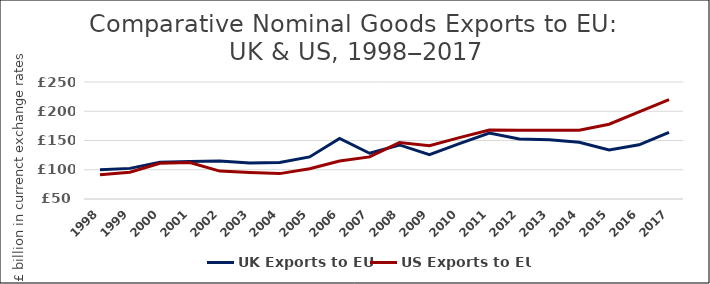
| Category | UK Exports to EU | US Exports to EU |
|---|---|---|
| 1998 | 100.111 | 91.649 |
| 1999 | 102.352 | 95.674 |
| 2000 | 112.834 | 111.023 |
| 2001 | 113.941 | 112.431 |
| 2002 | 114.766 | 97.733 |
| 2003 | 111.623 | 95.229 |
| 2004 | 112.324 | 93.399 |
| 2005 | 121.92 | 101.758 |
| 2006 | 153.387 | 114.976 |
| 2007 | 128.176 | 121.978 |
| 2008 | 142.404 | 146.523 |
| 2009 | 125.664 | 140.958 |
| 2010 | 144.508 | 154.981 |
| 2011 | 162.883 | 167.768 |
| 2012 | 152.501 | 167.445 |
| 2013 | 151.223 | 167.476 |
| 2014 | 146.872 | 167.658 |
| 2015 | 133.664 | 177.829 |
| 2016 | 142.705 | 198.746 |
| 2017 | 164.081 | 219.783 |